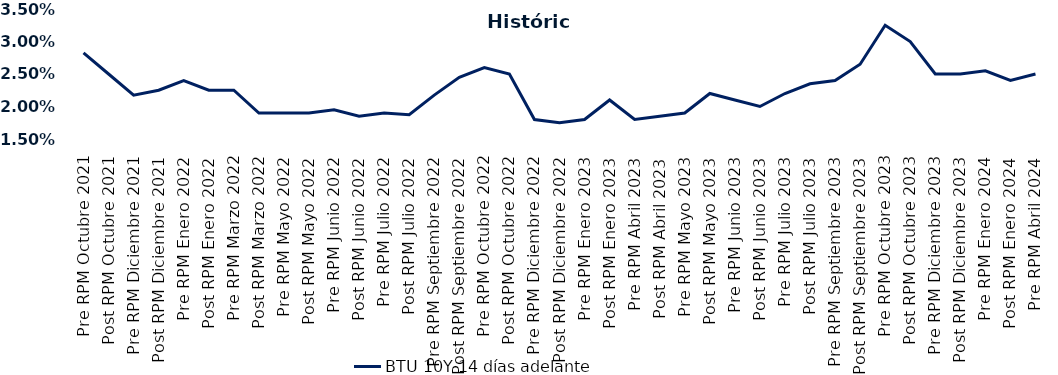
| Category | BTU 10Y 14 días adelante |
|---|---|
| Pre RPM Octubre 2021 | 0.028 |
| Post RPM Octubre 2021 | 0.025 |
| Pre RPM Diciembre 2021 | 0.022 |
| Post RPM Diciembre 2021 | 0.022 |
| Pre RPM Enero 2022 | 0.024 |
| Post RPM Enero 2022 | 0.022 |
| Pre RPM Marzo 2022 | 0.022 |
| Post RPM Marzo 2022 | 0.019 |
| Pre RPM Mayo 2022 | 0.019 |
| Post RPM Mayo 2022 | 0.019 |
| Pre RPM Junio 2022 | 0.02 |
| Post RPM Junio 2022 | 0.018 |
| Pre RPM Julio 2022 | 0.019 |
| Post RPM Julio 2022 | 0.019 |
| Pre RPM Septiembre 2022 | 0.022 |
| Post RPM Septiembre 2022 | 0.024 |
| Pre RPM Octubre 2022 | 0.026 |
| Post RPM Octubre 2022 | 0.025 |
| Pre RPM Diciembre 2022 | 0.018 |
| Post RPM Diciembre 2022 | 0.018 |
| Pre RPM Enero 2023 | 0.018 |
| Post RPM Enero 2023 | 0.021 |
| Pre RPM Abril 2023 | 0.018 |
| Post RPM Abril 2023 | 0.018 |
| Pre RPM Mayo 2023 | 0.019 |
| Post RPM Mayo 2023 | 0.022 |
| Pre RPM Junio 2023 | 0.021 |
| Post RPM Junio 2023 | 0.02 |
| Pre RPM Julio 2023 | 0.022 |
| Post RPM Julio 2023 | 0.024 |
| Pre RPM Septiembre 2023 | 0.024 |
| Post RPM Septiembre 2023 | 0.026 |
| Pre RPM Octubre 2023 | 0.032 |
| Post RPM Octubre 2023 | 0.03 |
| Pre RPM Diciembre 2023 | 0.025 |
| Post RPM Diciembre 2023 | 0.025 |
| Pre RPM Enero 2024 | 0.026 |
| Post RPM Enero 2024 | 0.024 |
| Pre RPM Abril 2024 | 0.025 |